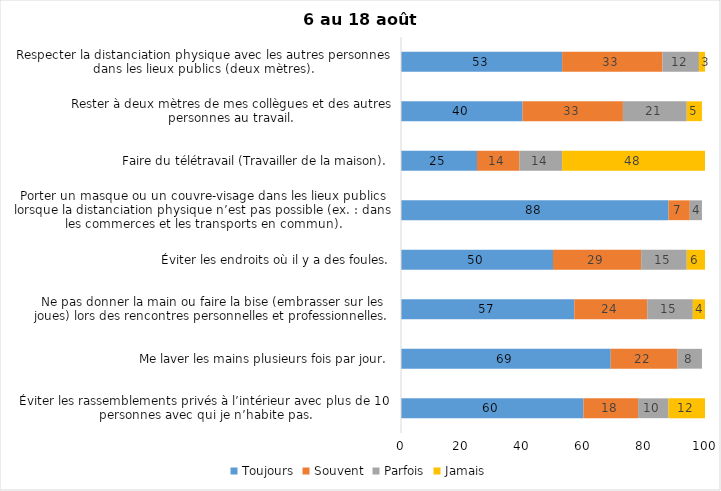
| Category | Toujours | Souvent | Parfois | Jamais |
|---|---|---|---|---|
| Éviter les rassemblements privés à l’intérieur avec plus de 10 personnes avec qui je n’habite pas. | 60 | 18 | 10 | 12 |
| Me laver les mains plusieurs fois par jour. | 69 | 22 | 8 | 0 |
| Ne pas donner la main ou faire la bise (embrasser sur les joues) lors des rencontres personnelles et professionnelles. | 57 | 24 | 15 | 4 |
| Éviter les endroits où il y a des foules. | 50 | 29 | 15 | 6 |
| Porter un masque ou un couvre-visage dans les lieux publics lorsque la distanciation physique n’est pas possible (ex. : dans les commerces et les transports en commun). | 88 | 7 | 4 | 0 |
| Faire du télétravail (Travailler de la maison). | 25 | 14 | 14 | 48 |
| Rester à deux mètres de mes collègues et des autres personnes au travail. | 40 | 33 | 21 | 5 |
| Respecter la distanciation physique avec les autres personnes dans les lieux publics (deux mètres). | 53 | 33 | 12 | 3 |